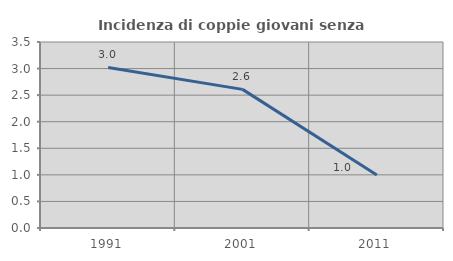
| Category | Incidenza di coppie giovani senza figli |
|---|---|
| 1991.0 | 3.022 |
| 2001.0 | 2.609 |
| 2011.0 | 0.998 |